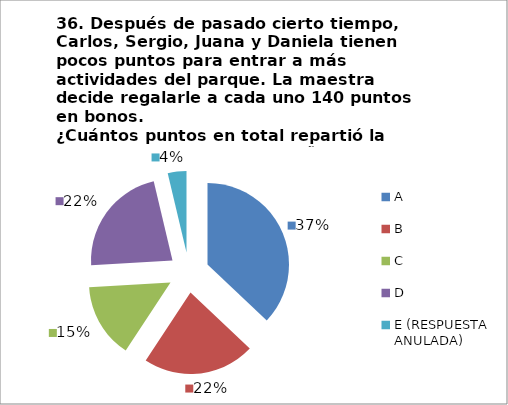
| Category | CANTIDAD DE RESPUESTAS PREGUNTA (36) | PORCENTAJE |
|---|---|---|
| A | 10 | 0.37 |
| B | 6 | 0.222 |
| C | 4 | 0.148 |
| D | 6 | 0.222 |
| E (RESPUESTA ANULADA) | 1 | 0.037 |